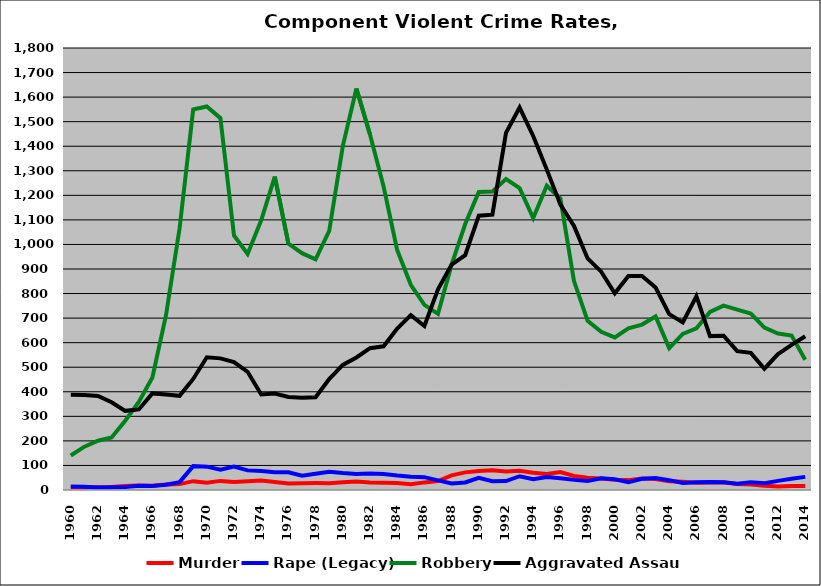
| Category | Murder | Rape (Legacy) | Robbery | Aggravated Assault |
|---|---|---|---|---|
| 1960.0 | 10.603 | 14.53 | 140.322 | 388.242 |
| 1961.0 | 11.519 | 13.09 | 176.45 | 386.802 |
| 1962.0 | 11.607 | 10.459 | 200.51 | 383.291 |
| 1963.0 | 11.905 | 10.902 | 213.91 | 357.268 |
| 1964.0 | 16.337 | 11.881 | 282.054 | 322.401 |
| 1965.0 | 18.431 | 17.435 | 358.78 | 328.144 |
| 1966.0 | 17.45 | 16.584 | 458.292 | 393.193 |
| 1967.0 | 22.002 | 21.261 | 711.867 | 388.504 |
| 1968.0 | 24.104 | 32.138 | 1065.76 | 383.56 |
| 1969.0 | 35.965 | 97.243 | 1549.624 | 452.256 |
| 1970.0 | 29.213 | 95.174 | 1561.909 | 540.508 |
| 1971.0 | 37.112 | 82.996 | 1514.44 | 536.032 |
| 1972.0 | 32.754 | 95.455 | 1036.23 | 520.989 |
| 1973.0 | 35.925 | 79.893 | 961.26 | 481.367 |
| 1974.0 | 38.313 | 77.593 | 1098.34 | 388.797 |
| 1975.0 | 32.821 | 72.626 | 1276.117 | 392.737 |
| 1976.0 | 26.781 | 72.365 | 1003.419 | 378.775 |
| 1977.0 | 27.826 | 58.261 | 964.493 | 375.942 |
| 1978.0 | 28.042 | 66.32 | 939.614 | 377.745 |
| 1979.0 | 27.439 | 74.543 | 1054.878 | 451.829 |
| 1980.0 | 31.485 | 69.109 | 1400.588 | 509.419 |
| 1981.0 | 35.063 | 65.094 | 1635.063 | 539.623 |
| 1982.0 | 30.745 | 66.719 | 1448.019 | 577.655 |
| 1983.0 | 29.374 | 65.169 | 1235.634 | 585.233 |
| 1984.0 | 28.09 | 58.748 | 977.047 | 657.624 |
| 1985.0 | 23.482 | 53.834 | 835.463 | 711.981 |
| 1986.0 | 30.99 | 52.396 | 753.994 | 667.891 |
| 1987.0 | 36.174 | 39.389 | 717.363 | 817.363 |
| 1988.0 | 59.516 | 26.613 | 917.742 | 917.742 |
| 1989.0 | 71.854 | 30.795 | 1083.113 | 956.126 |
| 1990.0 | 77.772 | 49.926 | 1213.544 | 1116.988 |
| 1991.0 | 80.602 | 35.786 | 1215.552 | 1121.405 |
| 1992.0 | 75.212 | 36.503 | 1266.384 | 1454.669 |
| 1993.0 | 78.547 | 56.055 | 1229.585 | 1557.612 |
| 1994.0 | 70 | 43.684 | 1107.193 | 1441.754 |
| 1995.0 | 64.982 | 52.708 | 1238.989 | 1304.693 |
| 1996.0 | 73.112 | 47.882 | 1186.74 | 1162.063 |
| 1997.0 | 56.9 | 41.21 | 850.851 | 1075.236 |
| 1998.0 | 49.713 | 36.329 | 689.484 | 943.021 |
| 1999.0 | 46.435 | 47.784 | 644.316 | 889.21 |
| 2000.0 | 41.779 | 43.877 | 621.265 | 800.966 |
| 2001.0 | 40.256 | 31.543 | 658.741 | 871.873 |
| 2002.0 | 46.384 | 46.033 | 673.628 | 871.816 |
| 2003.0 | 44.654 | 49.137 | 706.754 | 824.397 |
| 2004.0 | 35.725 | 40.055 | 577.729 | 715.937 |
| 2005.0 | 33.502 | 28.52 | 635.685 | 682.245 |
| 2006.0 | 29.061 | 31.813 | 658.436 | 789.125 |
| 2007.0 | 30.767 | 32.637 | 724.98 | 626.73 |
| 2008.0 | 31.521 | 31.521 | 750.753 | 628.226 |
| 2009.0 | 24.18 | 25.014 | 734.42 | 565.323 |
| 2010.0 | 21.937 | 31.077 | 718.769 | 558.396 |
| 2011.0 | 17.447 | 27.947 | 661.368 | 494.007 |
| 2012.0 | 13.893 | 37.258 | 637.327 | 553.339 |
| 2013.0 | 15.868 | 45.755 | 628.86 | 590.808 |
| 2014.0 | 15.936 | 53.423 | 530.739 | 626.05 |